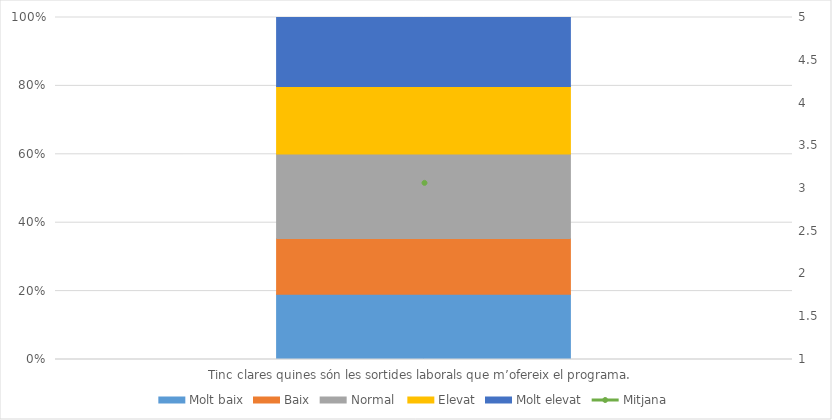
| Category | Molt baix | Baix | Normal  | Elevat | Molt elevat |
|---|---|---|---|---|---|
| Tinc clares quines són les sortides laborals que m’ofereix el programa. | 55 | 47 | 71 | 57 | 58 |